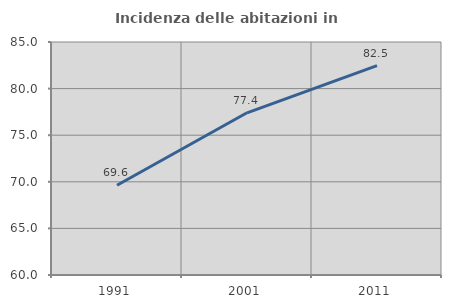
| Category | Incidenza delle abitazioni in proprietà  |
|---|---|
| 1991.0 | 69.63 |
| 2001.0 | 77.402 |
| 2011.0 | 82.467 |